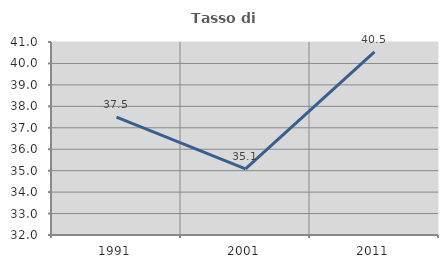
| Category | Tasso di occupazione   |
|---|---|
| 1991.0 | 37.5 |
| 2001.0 | 35.088 |
| 2011.0 | 40.541 |